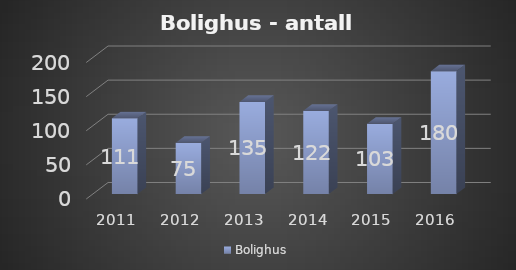
| Category | Bolighus |
|---|---|
| 2011.0 | 111 |
| 2012.0 | 75 |
| 2013.0 | 135 |
| 2014.0 | 122 |
| 2015.0 | 103 |
| 2016.0 | 180.074 |